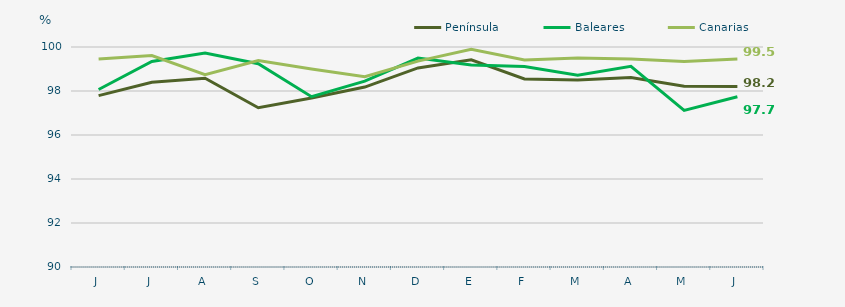
| Category | Península | Baleares | Canarias |
|---|---|---|---|
| J | 97.79 | 98.07 | 99.45 |
| J | 98.4 | 99.34 | 99.61 |
| A | 98.58 | 99.73 | 98.74 |
| S | 97.24 | 99.24 | 99.38 |
| O | 97.68 | 97.74 | 99 |
| N | 98.18 | 98.45 | 98.65 |
| D | 99.05 | 99.5 | 99.36 |
| E | 99.42 | 99.18 | 99.9 |
| F | 98.55 | 99.11 | 99.41 |
| M | 98.5 | 98.72 | 99.5 |
| A | 98.61 | 99.12 | 99.46 |
| M | 98.22 | 97.12 | 99.34 |
| J | 98.21 | 97.74 | 99.45 |